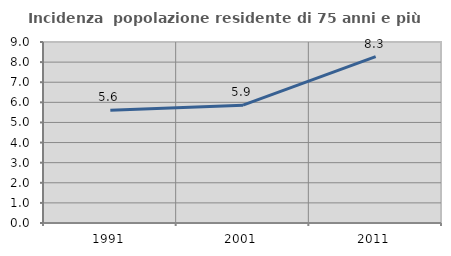
| Category | Incidenza  popolazione residente di 75 anni e più |
|---|---|
| 1991.0 | 5.607 |
| 2001.0 | 5.859 |
| 2011.0 | 8.276 |